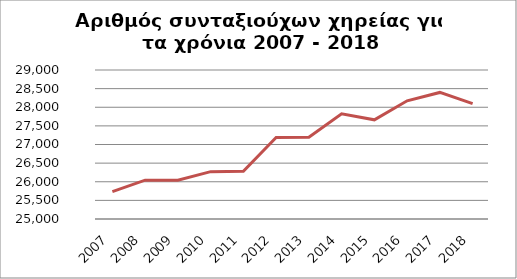
| Category | Series 1 |
|---|---|
| 2007.0 | 25735 |
| 2008.0 | 26043 |
| 2009.0 | 26039 |
| 2010.0 | 26271 |
| 2011.0 | 26279 |
| 2012.0 | 27190 |
| 2013.0 | 27194 |
| 2014.0 | 27824 |
| 2015.0 | 27663 |
| 2016.0 | 28173 |
| 2017.0 | 28398 |
| 2018.0 | 28098 |